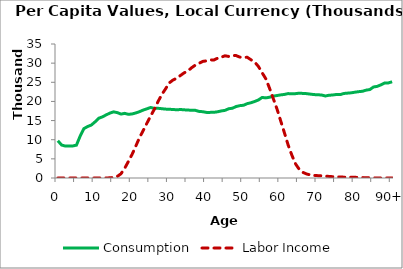
| Category | Consumption | Labor Income |
|---|---|---|
| 0 | 9734.939 | 0 |
|  | 8619.858 | 0.321 |
| 2 | 8344.521 | 0 |
| 3 | 8347.347 | 0 |
| 4 | 8368.864 | 0.331 |
| 5 | 8579.847 | 0 |
| 6 | 10932.33 | 0.359 |
| 7 | 12890.153 | 0.335 |
| 8 | 13440.268 | 0.517 |
| 9 | 13831.117 | 0.484 |
| 10 | 14646.403 | 0.551 |
| 11 | 15607.974 | 1.636 |
| 12 | 15966.392 | 3.439 |
| 13 | 16480.151 | 12.422 |
| 14 | 16947.383 | 44.574 |
| 15 | 17276.149 | 143.89 |
| 16 | 17080.236 | 413.18 |
| 17 | 16697.165 | 1113.633 |
| 18 | 16879.438 | 2561.317 |
| 19 | 16633.375 | 4341.824 |
| 20 | 16731.695 | 6202.081 |
| 21 | 16993.873 | 8361.19 |
| 22 | 17334.299 | 10595.724 |
| 23 | 17749.309 | 12429.767 |
| 24 | 18079.88 | 14366.486 |
| 25 | 18428.791 | 16218.069 |
| 26 | 18174.857 | 18005.694 |
| 27 | 18200.859 | 20024.728 |
| 28 | 18098.572 | 21819.412 |
| 29 | 17995.539 | 23286.711 |
| 30 | 17937.437 | 24847.945 |
| 31 | 17907.324 | 25592.494 |
| 32 | 17805.431 | 26063.076 |
| 33 | 17893.321 | 26768.11 |
| 34 | 17801.301 | 27470.62 |
| 35 | 17766.35 | 27953.99 |
| 36 | 17665.06 | 28788.094 |
| 37 | 17673.213 | 29477.546 |
| 38 | 17398.887 | 29956.793 |
| 39 | 17313.221 | 30453.749 |
| 40 | 17139.513 | 30593.465 |
| 41 | 17139.123 | 30860.473 |
| 42 | 17164.087 | 30827.819 |
| 43 | 17292.902 | 31284.719 |
| 44 | 17514.789 | 31555.904 |
| 45 | 17664.444 | 31920.374 |
| 46 | 18091.419 | 31748.134 |
| 47 | 18225.28 | 32015.003 |
| 48 | 18669.401 | 31966.982 |
| 49 | 18900.092 | 31573.078 |
| 50 | 19001.496 | 31519.114 |
| 51 | 19425.879 | 31516.373 |
| 52 | 19658.276 | 30870.003 |
| 53 | 19989.776 | 30273.758 |
| 54 | 20382.831 | 29133.808 |
| 55 | 21033.22 | 27483.143 |
| 56 | 20927.562 | 25898.746 |
| 57 | 21096.336 | 23431.559 |
| 58 | 21384.671 | 20728.13 |
| 59 | 21542.16 | 18027.467 |
| 60 | 21710.299 | 14894.848 |
| 61 | 21825.313 | 11791.214 |
| 62 | 22047.964 | 8627.238 |
| 63 | 21980.897 | 5962.606 |
| 64 | 22031.863 | 3671.953 |
| 65 | 22162.611 | 2250.635 |
| 66 | 22083.111 | 1453.766 |
| 67 | 22032.747 | 1042.252 |
| 68 | 21905.626 | 801.192 |
| 69 | 21785.825 | 675.075 |
| 70 | 21741.566 | 614.542 |
| 71 | 21677.01 | 572.733 |
| 72 | 21422.716 | 480.986 |
| 73 | 21609.471 | 414.549 |
| 74 | 21683.574 | 335.167 |
| 75 | 21812.692 | 279.94 |
| 76 | 21779.066 | 273.96 |
| 77 | 22076.472 | 217.98 |
| 78 | 22167.585 | 217.904 |
| 79 | 22250.896 | 193.291 |
| 80 | 22414.933 | 180.047 |
| 81 | 22551.667 | 125.955 |
| 82 | 22652.293 | 103.467 |
| 83 | 22949.279 | 75.681 |
| 84 | 23106.291 | 59.319 |
| 85 | 23778.955 | 44.366 |
| 86 | 23939.864 | 0 |
| 87 | 24339.58 | 0 |
| 88 | 24819.717 | 0 |
| 89 | 24842.043 | 0 |
| 90+ | 25138.238 | 0 |